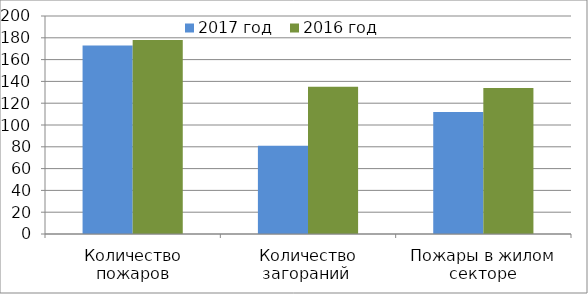
| Category | 2017 год | 2016 год |
|---|---|---|
| Количество пожаров | 173 | 178 |
| Количество загораний  | 81 | 135 |
| Пожары в жилом секторе | 112 | 134 |